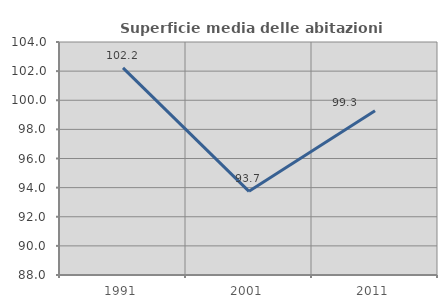
| Category | Superficie media delle abitazioni occupate |
|---|---|
| 1991.0 | 102.228 |
| 2001.0 | 93.744 |
| 2011.0 | 99.279 |